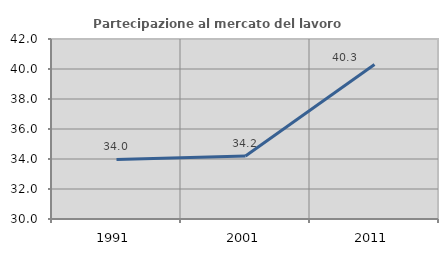
| Category | Partecipazione al mercato del lavoro  femminile |
|---|---|
| 1991.0 | 33.973 |
| 2001.0 | 34.203 |
| 2011.0 | 40.304 |